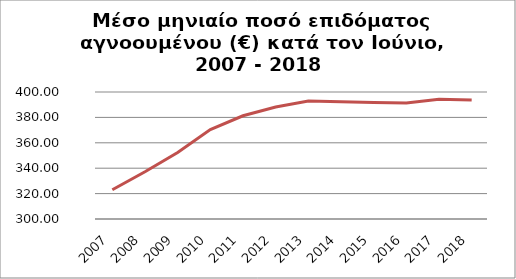
| Category | Series 1 |
|---|---|
| 2007.0 | 322.993 |
| 2008.0 | 337.19 |
| 2009.0 | 352.397 |
| 2010.0 | 370.359 |
| 2011.0 | 381.273 |
| 2012.0 | 388.193 |
| 2013.0 | 392.864 |
| 2014.0 | 392.227 |
| 2015.0 | 391.668 |
| 2016.0 | 391.32 |
| 2017.0 | 394.38 |
| 2018.0 | 393.61 |